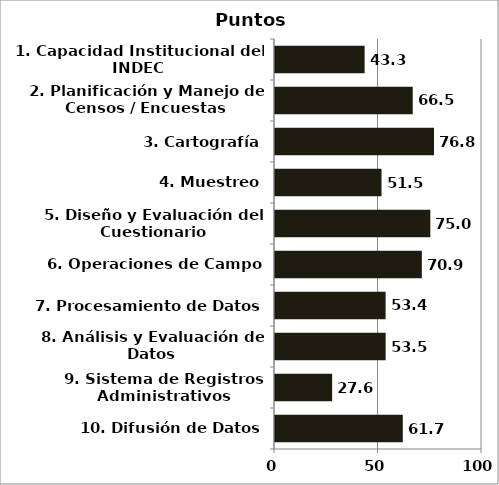
| Category | Series 0 |
|---|---|
| 1. Capacidad Institucional del INDEC | 43.302 |
| 2. Planificación y Manejo de Censos / Encuestas | 66.535 |
| 3. Cartografía | 76.812 |
| 4. Muestreo | 51.458 |
| 5. Diseño y Evaluación del Cuestionario | 75.047 |
| 6. Operaciones de Campo | 70.94 |
| 7. Procesamiento de Datos | 53.435 |
| 8. Análisis y Evaluación de Datos | 53.458 |
| 9. Sistema de Registros Administrativos | 27.604 |
| 10. Difusión de Datos | 61.725 |